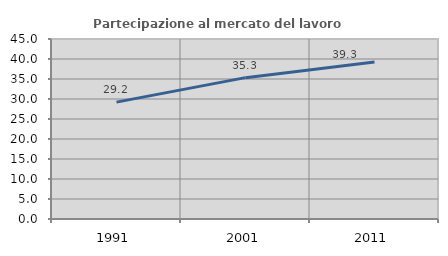
| Category | Partecipazione al mercato del lavoro  femminile |
|---|---|
| 1991.0 | 29.219 |
| 2001.0 | 35.338 |
| 2011.0 | 39.252 |